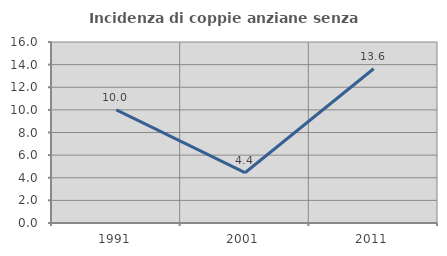
| Category | Incidenza di coppie anziane senza figli  |
|---|---|
| 1991.0 | 10 |
| 2001.0 | 4.444 |
| 2011.0 | 13.636 |